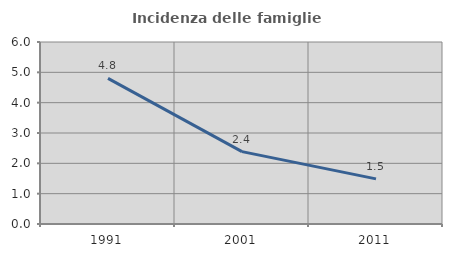
| Category | Incidenza delle famiglie numerose |
|---|---|
| 1991.0 | 4.799 |
| 2001.0 | 2.386 |
| 2011.0 | 1.488 |